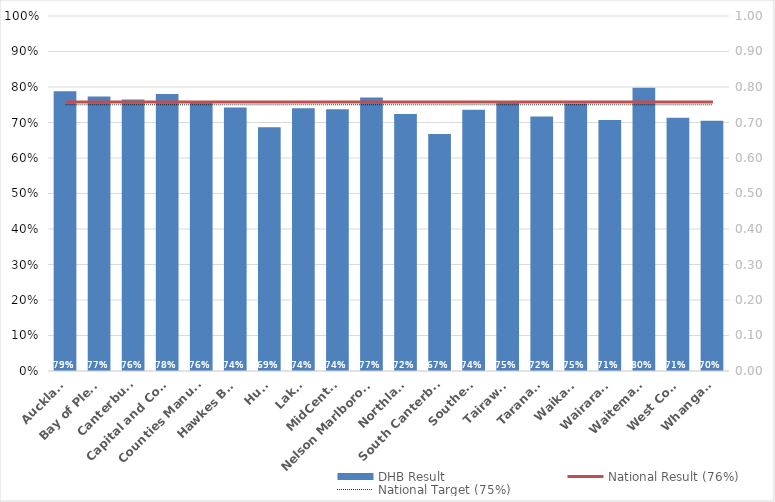
| Category | DHB Result |
|---|---|
| Auckland | 0.788 |
| Bay of Plenty | 0.773 |
| Canterbury | 0.765 |
| Capital and Coast | 0.781 |
| Counties Manukau | 0.761 |
| Hawkes Bay | 0.742 |
| Hutt | 0.687 |
| Lakes | 0.74 |
| MidCentral | 0.738 |
| Nelson Marlborough | 0.77 |
| Northland | 0.724 |
| South Canterbury | 0.668 |
| Southern | 0.736 |
| Tairawhiti | 0.755 |
| Taranaki | 0.717 |
| Waikato | 0.753 |
| Wairarapa | 0.707 |
| Waitemata | 0.798 |
| West Coast | 0.714 |
| Whanganui | 0.705 |